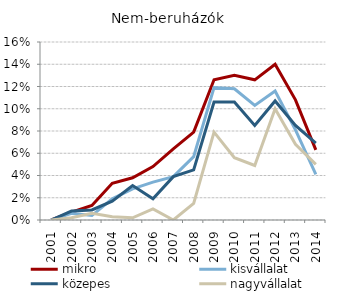
| Category | mikro | kisvállalat | közepes | nagyvállalat |
|---|---|---|---|---|
| 2001.0 | 0 | 0 | 0 | 0 |
| 2002.0 | 0.007 | 0.006 | 0.008 | 0.002 |
| 2003.0 | 0.013 | 0.004 | 0.009 | 0.006 |
| 2004.0 | 0.033 | 0.019 | 0.017 | 0.003 |
| 2005.0 | 0.038 | 0.028 | 0.031 | 0.002 |
| 2006.0 | 0.048 | 0.034 | 0.019 | 0.01 |
| 2007.0 | 0.064 | 0.039 | 0.039 | 0 |
| 2008.0 | 0.079 | 0.057 | 0.045 | 0.015 |
| 2009.0 | 0.126 | 0.119 | 0.106 | 0.079 |
| 2010.0 | 0.13 | 0.118 | 0.106 | 0.056 |
| 2011.0 | 0.126 | 0.103 | 0.085 | 0.049 |
| 2012.0 | 0.14 | 0.116 | 0.107 | 0.1 |
| 2013.0 | 0.108 | 0.081 | 0.085 | 0.068 |
| 2014.0 | 0.063 | 0.041 | 0.069 | 0.05 |